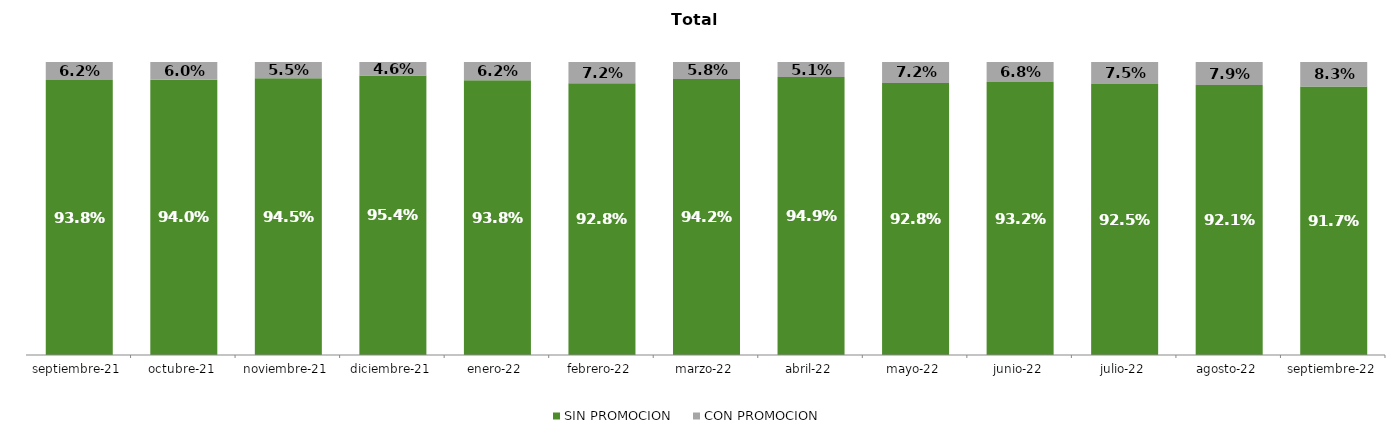
| Category | SIN PROMOCION   | CON PROMOCION   |
|---|---|---|
| 2021-09-01 | 0.938 | 0.062 |
| 2021-10-01 | 0.94 | 0.06 |
| 2021-11-01 | 0.945 | 0.055 |
| 2021-12-01 | 0.954 | 0.046 |
| 2022-01-01 | 0.938 | 0.062 |
| 2022-02-01 | 0.928 | 0.072 |
| 2022-03-01 | 0.942 | 0.058 |
| 2022-04-01 | 0.949 | 0.051 |
| 2022-05-01 | 0.928 | 0.072 |
| 2022-06-01 | 0.932 | 0.068 |
| 2022-07-01 | 0.925 | 0.075 |
| 2022-08-01 | 0.921 | 0.079 |
| 2022-09-01 | 0.917 | 0.083 |